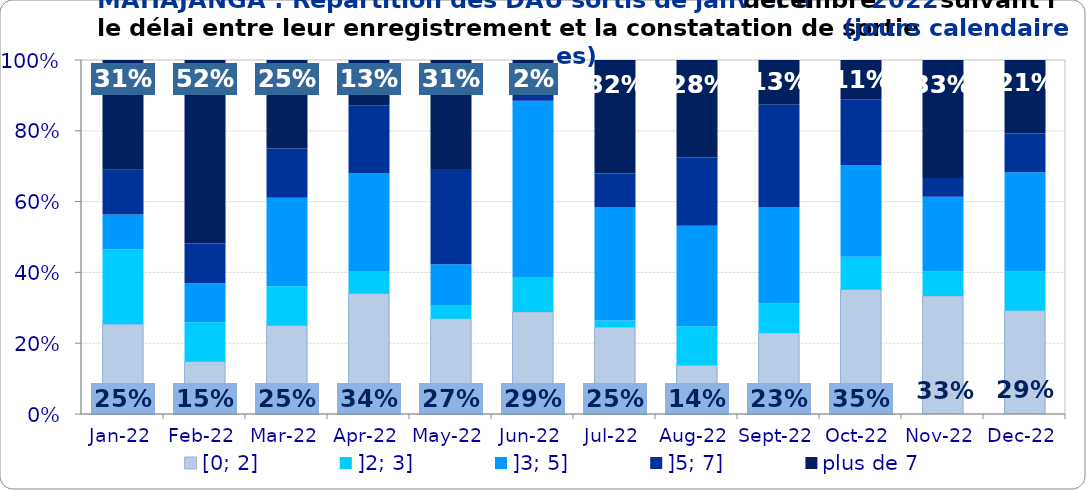
| Category | [0; 2] | ]2; 3] | ]3; 5] | ]5; 7] | plus de 7 |
|---|---|---|---|---|---|
| 2022-01-01 | 0.254 | 0.211 | 0.099 | 0.127 | 0.31 |
| 2022-02-01 | 0.148 | 0.111 | 0.111 | 0.111 | 0.519 |
| 2022-03-01 | 0.25 | 0.111 | 0.25 | 0.139 | 0.25 |
| 2022-04-01 | 0.34 | 0.064 | 0.277 | 0.191 | 0.128 |
| 2022-05-01 | 0.269 | 0.038 | 0.115 | 0.269 | 0.308 |
| 2022-06-01 | 0.288 | 0.096 | 0.5 | 0.096 | 0.019 |
| 2022-07-01 | 0.245 | 0.019 | 0.321 | 0.094 | 0.321 |
| 2022-08-01 | 0.138 | 0.11 | 0.284 | 0.193 | 0.275 |
| 2022-09-01 | 0.229 | 0.083 | 0.271 | 0.292 | 0.125 |
| 2022-10-01 | 0.352 | 0.093 | 0.259 | 0.185 | 0.111 |
| 2022-11-01 | 0.333 | 0.07 | 0.211 | 0.053 | 0.333 |
| 2022-12-01 | 0.293 | 0.11 | 0.28 | 0.11 | 0.207 |